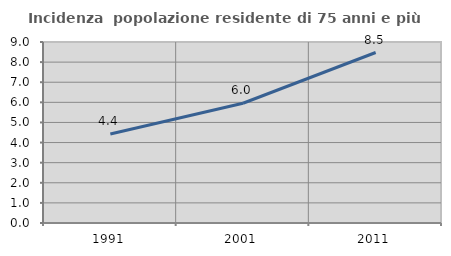
| Category | Incidenza  popolazione residente di 75 anni e più |
|---|---|
| 1991.0 | 4.423 |
| 2001.0 | 5.953 |
| 2011.0 | 8.477 |